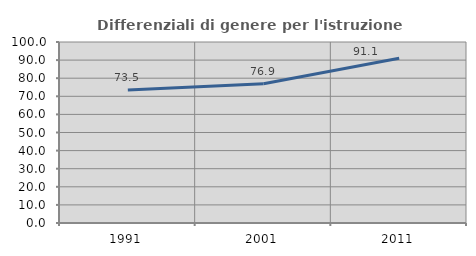
| Category | Differenziali di genere per l'istruzione superiore |
|---|---|
| 1991.0 | 73.504 |
| 2001.0 | 76.916 |
| 2011.0 | 91.072 |